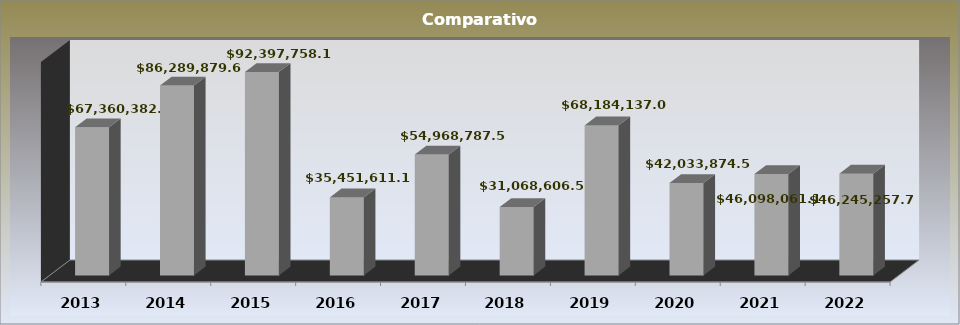
| Category | Series 0 |
|---|---|
| 2013.0 | 67360382.57 |
| 2014.0 | 86289879.62 |
| 2015.0 | 92397758.15 |
| 2016.0 | 35451611.18 |
| 2017.0 | 54968787.54 |
| 2018.0 | 31068606.51 |
| 2019.0 | 68184137.03 |
| 2020.0 | 42033874.55 |
| 2021.0 | 46098061.14 |
| 2022.0 | 46245257.72 |